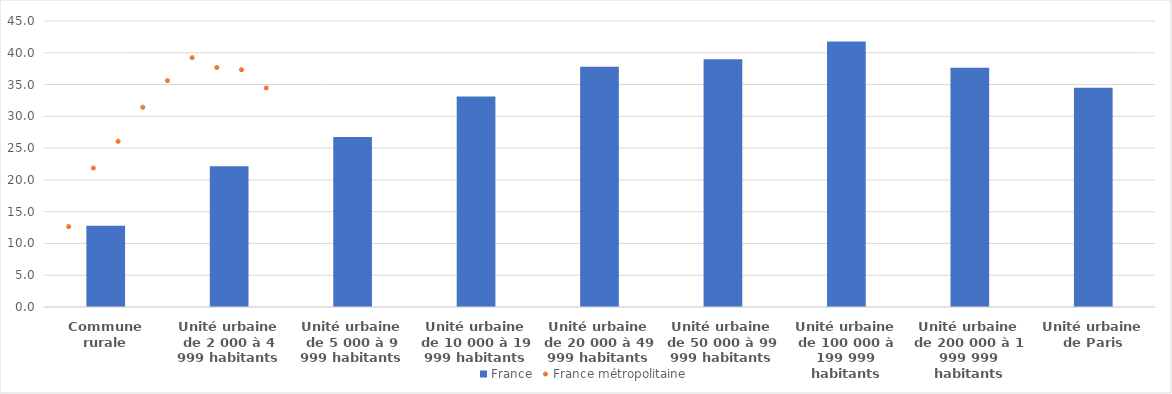
| Category | France |
|---|---|
| Commune rurale | 12.765 |
| Unité urbaine de 2 000 à 4 999 habitants | 22.127 |
| Unité urbaine de 5 000 à 9 999 habitants | 26.752 |
| Unité urbaine de 10 000 à 19 999 habitants | 33.121 |
| Unité urbaine de 20 000 à 49 999 habitants | 37.811 |
| Unité urbaine de 50 000 à 99 999 habitants | 38.966 |
| Unité urbaine de 100 000 à 199 999 habitants | 41.774 |
| Unité urbaine de 200 000 à 1 999 999 habitants | 37.63 |
| Unité urbaine de Paris | 34.478 |